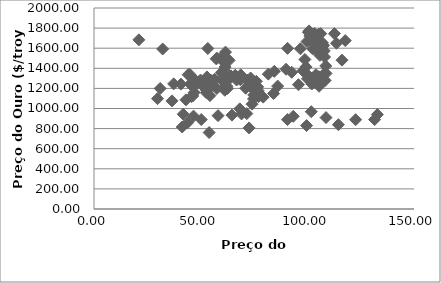
| Category | Series 0 |
|---|---|
| 90.6899350649351 | 889.595 |
| 93.3875906432749 | 922.298 |
| 101.842833333333 | 968.434 |
| 108.758181818182 | 909.705 |
| 122.632608946609 | 888.663 |
| 131.521111111111 | 889.488 |
| 132.825184453228 | 939.772 |
| 114.566825396825 | 839.025 |
| 99.6567676767677 | 829.932 |
| 72.6927536231884 | 806.62 |
| 53.9727280701754 | 760.863 |
| 41.338924963925 | 816.092 |
| 43.8552142857143 | 858.69 |
| 41.8436754385965 | 943 |
| 46.645303030303 | 924.273 |
| 50.2780952380952 | 890.2 |
| 58.1538888888889 | 928.645 |
| 69.149696969697 | 945.67 |
| 64.6666732542819 | 934.228 |
| 71.6296825396825 | 949.375 |
| 68.3461111111111 | 996.591 |
| 74.080606060606 | 1043.159 |
| 77.5523015873016 | 1127.036 |
| 74.8818181818182 | 1134.724 |
| 77.1210877192983 | 1117.963 |
| 74.7630155945419 | 1095.413 |
| 79.2976811594203 | 1113.337 |
| 84.1828571428572 | 1148.688 |
| 75.6183174603175 | 1205.434 |
| 74.725 | 1232.92 |
| 74.5794011544011 | 1192.966 |
| 75.8262698412698 | 1215.81 |
| 76.116240981241 | 1270.977 |
| 81.7193650793651 | 1342.024 |
| 84.5340634920635 | 1369.886 |
| 90.0059617918314 | 1390.553 |
| 92.6905952380952 | 1360.46 |
| 97.9141920077973 | 1374.68 |
| 108.645217391304 | 1423.26 |
| 116.243166666667 | 1480.89 |
| 108.068512987013 | 1512.58 |
| 105.845454545455 | 1529.36 |
| 107.916611111111 | 1572.75 |
| 100.486425120773 | 1759.01 |
| 100.819350649351 | 1772.14 |
| 99.847753968254 | 1666.43 |
| 105.405014430014 | 1739 |
| 104.230476190476 | 1639.97 |
| 107.074572263993 | 1654.05 |
| 112.687523809524 | 1744.82 |
| 117.785 | 1675.95 |
| 113.6655 | 1649.2 |
| 104.086034255599 | 1589.04 |
| 90.728253968254 | 1598.76 |
| 96.7541125541126 | 1594.29 |
| 105.273636991028 | 1630.31 |
| 106.284964912281 | 1744.81 |
| 103.407865612648 | 1746.58 |
| 101.174415584416 | 1721.64 |
| 101.193666666667 | 1684.762 |
| 105.100216450216 | 1671.848 |
| 107.637435672515 | 1627.57 |
| 102.5225 | 1593.086 |
| 98.8519696969697 | 1487.857 |
| 99.3666334148943 | 1414.027 |
| 99.7426666666667 | 1343.35 |
| 105.25790513834 | 1285.516 |
| 108.157636363636 | 1351.742 |
| 108.75773015873 | 1348.6 |
| 105.427134387352 | 1316.58 |
| 102.62649122807 | 1275.86 |
| 105.481650793651 | 1221.512 |
| 102.096666666667 | 1244.27 |
| 104.826666666667 | 1299.58 |
| 104.04 | 1336.08 |
| 104.866666666667 | 1298.45 |
| 105.713333333333 | 1288.74 |
| 108.373333333333 | 1279.1 |
| 105.226666666667 | 1310.59 |
| 100.05 | 1295.13 |
| 95.85 | 1236.55 |
| 86.08 | 1222.49 |
| 76.9933333333333 | 1175.33 |
| 60.7033333333333 | 1200.62 |
| 47.1066666666667 | 1250.75 |
| 54.79 | 1227.08 |
| 52.8266666666667 | 1178.63 |
| 57.5433333333333 | 1198.93 |
| 62.5066666666667 | 1198.63 |
| 61.3066666666667 | 1181.5 |
| 54.34 | 1128.31 |
| 45.69 | 1117.93 |
| 46.28 | 1124.77 |
| 46.9566666666667 | 1159.25 |
| 43.1133333333333 | 1086.44 |
| 36.5733333333333 | 1075.74 |
| 29.78 | 1097.91 |
| 31.03 | 1199.5 |
| 37.34 | 1245.14 |
| 40.75 | 1242.26 |
| 45.9366666666667 | 1260.95 |
| 47.6866666666667 | 1276.4 |
| 44.1266666666667 | 1336.66 |
| 44.8766666666667 | 1340.17 |
| 45.0433333333333 | 1326.61 |
| 49.2933333333333 | 1266.55 |
| 45.26 | 1238.35 |
| 52.62 | 1157.36 |
| 53.59 | 1192.1 |
| 54.3533333333333 | 1234.2 |
| 50.9033333333333 | 1231.42 |
| 52.1633333333333 | 1266.88 |
| 49.8933333333333 | 1246.04 |
| 46.1666666666667 | 1260.26 |
| 47.6566666666667 | 1236.84 |
| 49.9433333333333 | 1283.04 |
| 52.95 | 1314.07 |
| 54.92 | 1279.51 |
| 59.9333333333333 | 1281.9 |
| 61.1866666666667 | 1264.45 |
| 66.2266666666667 | 1331.3 |
| 63.46 | 1330.73 |
| 64.1666666666667 | 1324.66 |
| 68.7933333333333 | 1334.76 |
| 73.43 | 1303.45 |
| 71.9766666666667 | 1281.57 |
| 72.6666666666667 | 1237.71 |
| 71.0833333333333 | 1201.71 |
| 75.3633333333333 | 1198.39 |
| 76.7266666666667 | 1215.39 |
| 62.3166666666667 | 1220.65 |
| 53.96 | 1250.4 |
| 56.5833333333333 | 1291.75 |
| 61.1333333333333 | 1320.07 |
| 63.7866666666667 | 1300.9 |
| 68.5766666666667 | 1285.91 |
| 66.8333333333333 | 1283.7 |
| 59.76 | 1359.04 |
| 61.4766666666667 | 1412.89 |
| 57.67 | 1500.41 |
| 60.04 | 1510.58 |
| 57.2733333333333 | 1494.81 |
| 60.4033333333333 | 1470.79 |
| 63.3533333333333 | 1479.13 |
| 61.6266666666667 | 1560.67 |
| 53.3466666666667 | 1597.1 |
| 32.2033333333333 | 1591.93 |
| 21.0433333333333 | 1683.17 |